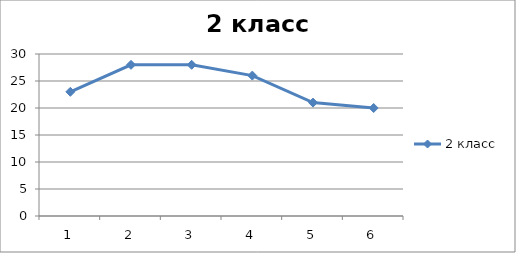
| Category | 2 класс |
|---|---|
| 0 | 23 |
| 1 | 28 |
| 2 | 28 |
| 3 | 26 |
| 4 | 21 |
| 5 | 20 |